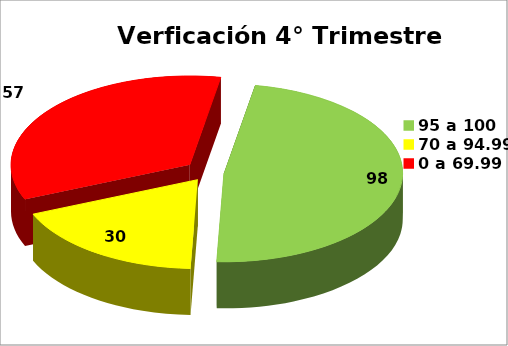
| Category | Sujetos Obligados |
|---|---|
| 95 a 100 | 101 |
| 70 a 94.99 | 38 |
| 0 a 69.99 | 72 |